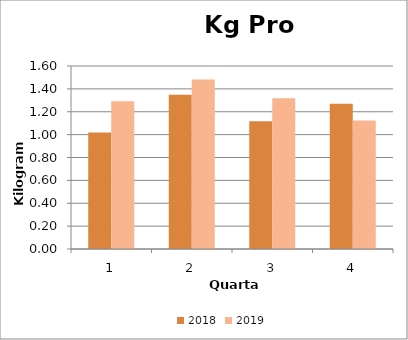
| Category | 2018 | 2019 |
|---|---|---|
| 0 | 1.019 | 1.292 |
| 1 | 1.348 | 1.483 |
| 2 | 1.118 | 1.318 |
| 3 | 1.269 | 1.124 |